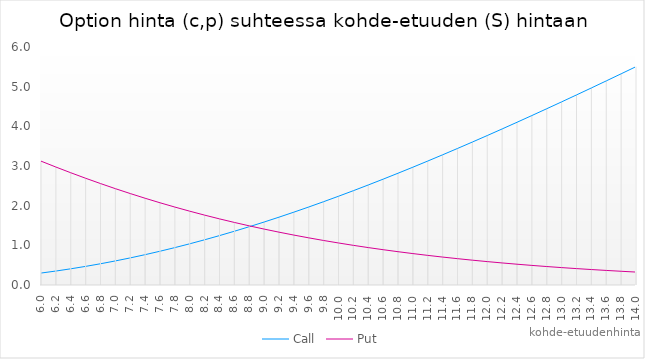
| Category | Call | Put |
|---|---|---|
| 6.000000000000005 | 0.301 | 3.123 |
| 6.2000000000000055 | 0.352 | 2.974 |
| 6.400000000000006 | 0.408 | 2.83 |
| 6.600000000000006 | 0.469 | 2.691 |
| 6.800000000000006 | 0.536 | 2.557 |
| 7.000000000000006 | 0.607 | 2.429 |
| 7.200000000000006 | 0.683 | 2.305 |
| 7.400000000000007 | 0.765 | 2.187 |
| 7.600000000000007 | 0.851 | 2.073 |
| 7.800000000000007 | 0.943 | 1.964 |
| 8.000000000000007 | 1.039 | 1.861 |
| 8.200000000000006 | 1.14 | 1.762 |
| 8.400000000000006 | 1.245 | 1.667 |
| 8.600000000000005 | 1.355 | 1.577 |
| 8.800000000000004 | 1.469 | 1.491 |
| 9.000000000000004 | 1.588 | 1.41 |
| 9.200000000000003 | 1.71 | 1.332 |
| 9.400000000000002 | 1.837 | 1.258 |
| 9.600000000000001 | 1.967 | 1.188 |
| 9.8 | 2.1 | 1.122 |
| 10.0 | 2.237 | 1.059 |
| 10.2 | 2.378 | 1 |
| 10.399999999999999 | 2.522 | 0.943 |
| 10.599999999999998 | 2.668 | 0.89 |
| 10.799999999999997 | 2.818 | 0.84 |
| 10.999999999999996 | 2.97 | 0.792 |
| 11.199999999999996 | 3.125 | 0.747 |
| 11.399999999999995 | 3.282 | 0.704 |
| 11.599999999999994 | 3.442 | 0.664 |
| 11.799999999999994 | 3.604 | 0.626 |
| 11.999999999999993 | 3.768 | 0.59 |
| 12.199999999999992 | 3.934 | 0.556 |
| 12.399999999999991 | 4.102 | 0.524 |
| 12.59999999999999 | 4.272 | 0.494 |
| 12.79999999999999 | 4.444 | 0.465 |
| 12.99999999999999 | 4.617 | 0.439 |
| 13.199999999999989 | 4.792 | 0.413 |
| 13.399999999999988 | 4.968 | 0.39 |
| 13.599999999999987 | 5.145 | 0.367 |
| 13.799999999999986 | 5.324 | 0.346 |
| 13.999999999999986 | 5.504 | 0.326 |